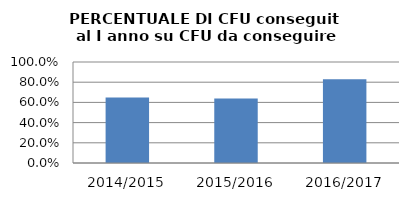
| Category | 2014/2015 2015/2016 2016/2017 |
|---|---|
| 2014/2015 | 0.649 |
| 2015/2016 | 0.638 |
| 2016/2017 | 0.828 |